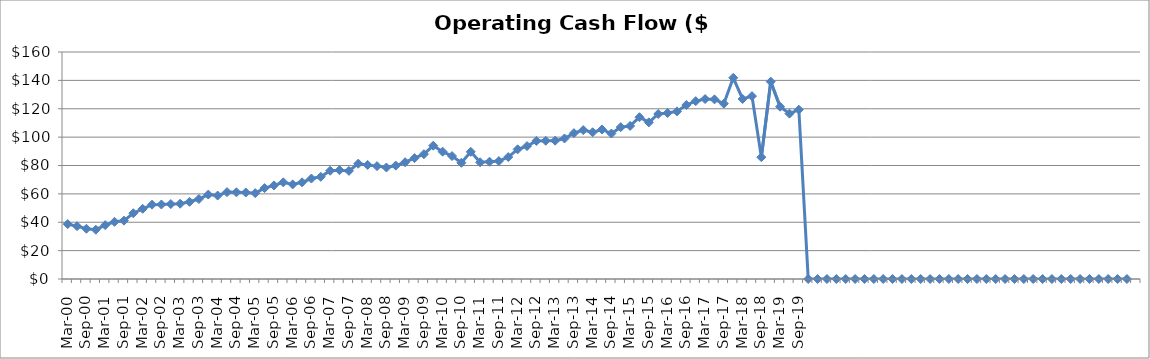
| Category | Operating Cash Flow ($Millions) |
|---|---|
| Mar-00 | 38.702 |
| Jun-00 | 37.236 |
| Sep-00 | 35.416 |
| Dec-00 | 34.746 |
| Mar-01 | 37.964 |
| Jun-01 | 40.311 |
| Sep-01 | 41.13 |
| Dec-01 | 46.364 |
| Mar-02 | 49.48 |
| Jun-02 | 52.408 |
| Sep-02 | 52.517 |
| Dec-02 | 52.821 |
| Mar-03 | 53.056 |
| Jun-03 | 54.412 |
| Sep-03 | 56.391 |
| Dec-03 | 59.51 |
| Mar-04 | 58.802 |
| Jun-04 | 61.258 |
| Sep-04 | 61.106 |
| Dec-04 | 60.957 |
| Mar-05 | 60.512 |
| Jun-05 | 64.07 |
| Sep-05 | 65.946 |
| Dec-05 | 68.148 |
| Mar-06 | 66.672 |
| Jun-06 | 68.156 |
| Sep-06 | 70.798 |
| Dec-06 | 72.021 |
| Mar-07 | 76.31 |
| Jun-07 | 76.692 |
| Sep-07 | 76.2 |
| Dec-07 | 81.302 |
| Mar-08 | 80.404 |
| Jun-08 | 79.556 |
| Sep-08 | 78.579 |
| Dec-08 | 79.94 |
| Mar-09 | 82.328 |
| Jun-09 | 85.212 |
| Sep-09 | 87.968 |
| Dec-09 | 93.955 |
| Mar-10 | 89.746 |
| Jun-10 | 86.681 |
| Sep-10 | 81.923 |
| Dec-10 | 89.666 |
| Mar-11 | 82.256 |
| Jun-11 | 82.657 |
| Sep-11 | 83.13 |
| Dec-11 | 85.96 |
| Mar-12 | 91.377 |
| Jun-12 | 93.688 |
| Sep-12 | 97.32 |
| Dec-12 | 97.434 |
| Mar-13 | 97.507 |
| Jun-13 | 99.034 |
| Sep-13 | 102.819 |
| Dec-13 | 104.965 |
| Mar-14 | 103.416 |
| Jun-14 | 105.396 |
| Sep-14 | 102.52 |
| Dec-14 | 107.02 |
| Mar-15 | 107.899 |
| Jun-15 | 114.042 |
| Sep-15 | 110.4 |
| Dec-15 | 116.299 |
| Mar-16 | 117.01 |
| Jun-16 | 118.144 |
| Sep-16 | 122.657 |
| Dec-16 | 125.367 |
| Mar-17 | 126.834 |
| Jun-17 | 126.602 |
| Sep-17 | 123.602 |
| Dec-17 | 141.838 |
| Mar-18 | 126.91 |
| Jun-18 | 128.902 |
| Sep-18 | 85.835 |
| Dec-18 | 139.1 |
| Mar-19 | 121.452 |
| Jun-19 | 116.55 |
| Sep-19 | 119.338 |